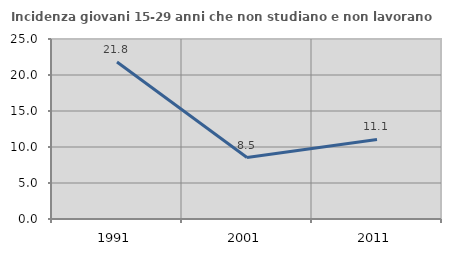
| Category | Incidenza giovani 15-29 anni che non studiano e non lavorano  |
|---|---|
| 1991.0 | 21.809 |
| 2001.0 | 8.531 |
| 2011.0 | 11.053 |